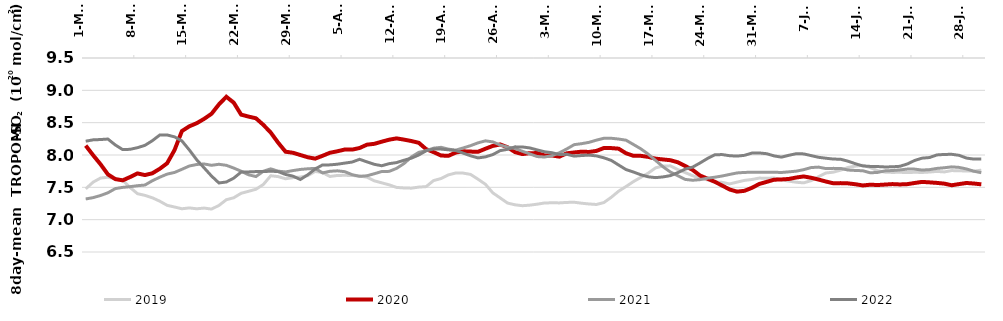
| Category | 2019 | 2020 | 2021 | 2022 |
|---|---|---|---|---|
| 2000-03-01 | 7.476 | 8.146 | 7.32 | 8.213 |
| 2000-03-02 | 7.58 | 7.997 | 7.341 | 8.234 |
| 2000-03-03 | 7.643 | 7.857 | 7.373 | 8.239 |
| 2000-03-04 | 7.656 | 7.7 | 7.416 | 8.247 |
| 2000-03-05 | 7.631 | 7.628 | 7.48 | 8.155 |
| 2000-03-06 | 7.607 | 7.608 | 7.499 | 8.083 |
| 2000-03-07 | 7.497 | 7.659 | 7.51 | 8.088 |
| 2000-03-08 | 7.402 | 7.715 | 7.525 | 8.113 |
| 2000-03-09 | 7.376 | 7.69 | 7.535 | 8.149 |
| 2000-03-10 | 7.339 | 7.717 | 7.602 | 8.221 |
| 2000-03-11 | 7.286 | 7.786 | 7.656 | 8.309 |
| 2000-03-12 | 7.222 | 7.872 | 7.704 | 8.31 |
| 2000-03-13 | 7.196 | 8.076 | 7.73 | 8.281 |
| 2000-03-14 | 7.168 | 8.37 | 7.779 | 8.218 |
| 2000-03-15 | 7.182 | 8.444 | 7.83 | 8.078 |
| 2000-03-16 | 7.168 | 8.492 | 7.853 | 7.926 |
| 2000-03-17 | 7.179 | 8.559 | 7.861 | 7.801 |
| 2000-03-18 | 7.164 | 8.637 | 7.841 | 7.675 |
| 2000-03-19 | 7.22 | 8.782 | 7.857 | 7.568 |
| 2000-03-20 | 7.308 | 8.9 | 7.84 | 7.583 |
| 2000-03-21 | 7.339 | 8.81 | 7.798 | 7.642 |
| 2000-03-22 | 7.408 | 8.624 | 7.749 | 7.736 |
| 2000-03-23 | 7.439 | 8.594 | 7.694 | 7.738 |
| 2000-03-24 | 7.47 | 8.568 | 7.667 | 7.744 |
| 2000-03-25 | 7.544 | 8.466 | 7.749 | 7.743 |
| 2000-03-26 | 7.679 | 8.347 | 7.786 | 7.75 |
| 2000-03-27 | 7.666 | 8.19 | 7.75 | 7.744 |
| 2000-03-28 | 7.632 | 8.051 | 7.738 | 7.699 |
| 2000-03-29 | 7.65 | 8.034 | 7.759 | 7.673 |
| 2000-03-30 | 7.659 | 8 | 7.777 | 7.621 |
| 2000-03-31 | 7.68 | 7.965 | 7.787 | 7.694 |
| 2000-04-01 | 7.746 | 7.944 | 7.793 | 7.784 |
| 2000-04-02 | 7.728 | 7.988 | 7.723 | 7.846 |
| 2000-04-03 | 7.668 | 8.035 | 7.748 | 7.847 |
| 2000-04-04 | 7.684 | 8.057 | 7.755 | 7.857 |
| 2000-04-05 | 7.686 | 8.085 | 7.742 | 7.875 |
| 2000-04-06 | 7.683 | 8.083 | 7.696 | 7.891 |
| 2000-04-07 | 7.676 | 8.108 | 7.67 | 7.933 |
| 2000-04-08 | 7.656 | 8.16 | 7.679 | 7.894 |
| 2000-04-09 | 7.6 | 8.173 | 7.71 | 7.856 |
| 2000-04-10 | 7.57 | 8.206 | 7.745 | 7.834 |
| 2000-04-11 | 7.538 | 8.237 | 7.747 | 7.866 |
| 2000-04-12 | 7.499 | 8.257 | 7.793 | 7.883 |
| 2000-04-13 | 7.49 | 8.238 | 7.867 | 7.919 |
| 2000-04-14 | 7.487 | 8.216 | 7.97 | 7.951 |
| 2000-04-15 | 7.503 | 8.189 | 8.041 | 8 |
| 2000-04-16 | 7.511 | 8.09 | 8.067 | 8.066 |
| 2000-04-17 | 7.605 | 8.045 | 8.106 | 8.092 |
| 2000-04-18 | 7.636 | 7.992 | 8.119 | 8.091 |
| 2000-04-19 | 7.693 | 7.987 | 8.091 | 8.08 |
| 2000-04-20 | 7.722 | 8.038 | 8.075 | 8.069 |
| 2000-04-21 | 7.72 | 8.057 | 8.109 | 8.029 |
| 2000-04-22 | 7.7 | 8.053 | 8.145 | 7.988 |
| 2000-04-23 | 7.626 | 8.049 | 8.188 | 7.955 |
| 2000-04-24 | 7.548 | 8.096 | 8.219 | 7.971 |
| 2000-04-25 | 7.415 | 8.14 | 8.203 | 8.006 |
| 2000-04-26 | 7.336 | 8.163 | 8.154 | 8.068 |
| 2000-04-27 | 7.257 | 8.119 | 8.122 | 8.087 |
| 2000-04-28 | 7.23 | 8.045 | 8.102 | 8.126 |
| 2000-04-29 | 7.216 | 8.014 | 8.057 | 8.124 |
| 2000-04-30 | 7.225 | 8.028 | 8.017 | 8.109 |
| 2000-05-01 | 7.24 | 8.03 | 7.976 | 8.079 |
| 2000-05-02 | 7.259 | 7.994 | 7.969 | 8.05 |
| 2000-05-03 | 7.261 | 7.992 | 7.99 | 8.035 |
| 2000-05-04 | 7.259 | 7.975 | 8.034 | 8.007 |
| 2000-05-05 | 7.267 | 8.026 | 8.094 | 8.011 |
| 2000-05-06 | 7.27 | 8.039 | 8.16 | 7.983 |
| 2000-05-07 | 7.254 | 8.052 | 8.175 | 7.992 |
| 2000-05-08 | 7.243 | 8.047 | 8.196 | 7.998 |
| 2000-05-09 | 7.235 | 8.063 | 8.23 | 7.986 |
| 2000-05-10 | 7.264 | 8.107 | 8.258 | 7.957 |
| 2000-05-11 | 7.345 | 8.107 | 8.259 | 7.917 |
| 2000-05-12 | 7.44 | 8.098 | 8.247 | 7.845 |
| 2000-05-13 | 7.513 | 8.027 | 8.229 | 7.775 |
| 2000-05-14 | 7.589 | 7.988 | 8.163 | 7.737 |
| 2000-05-15 | 7.654 | 7.987 | 8.096 | 7.694 |
| 2000-05-16 | 7.719 | 7.971 | 8.013 | 7.663 |
| 2000-05-17 | 7.801 | 7.943 | 7.915 | 7.65 |
| 2000-05-18 | 7.83 | 7.931 | 7.818 | 7.661 |
| 2000-05-19 | 7.832 | 7.919 | 7.736 | 7.681 |
| 2000-05-20 | 7.774 | 7.887 | 7.68 | 7.728 |
| 2000-05-21 | 7.728 | 7.83 | 7.623 | 7.782 |
| 2000-05-22 | 7.68 | 7.77 | 7.61 | 7.813 |
| 2000-05-23 | 7.643 | 7.682 | 7.619 | 7.877 |
| 2000-05-24 | 7.615 | 7.634 | 7.641 | 7.946 |
| 2000-05-25 | 7.583 | 7.585 | 7.657 | 8.004 |
| 2000-05-26 | 7.577 | 7.527 | 7.676 | 8.006 |
| 2000-05-27 | 7.552 | 7.467 | 7.7 | 7.989 |
| 2000-05-28 | 7.581 | 7.433 | 7.723 | 7.983 |
| 2000-05-29 | 7.607 | 7.446 | 7.731 | 7.995 |
| 2000-05-30 | 7.621 | 7.492 | 7.733 | 8.029 |
| 2000-05-31 | 7.643 | 7.552 | 7.732 | 8.032 |
| 2000-06-01 | 7.64 | 7.584 | 7.734 | 8.02 |
| 2000-06-02 | 7.644 | 7.618 | 7.734 | 7.986 |
| 2000-06-03 | 7.616 | 7.622 | 7.73 | 7.967 |
| 2000-06-04 | 7.596 | 7.629 | 7.739 | 7.996 |
| 2000-06-05 | 7.579 | 7.652 | 7.75 | 8.02 |
| 2000-06-06 | 7.569 | 7.668 | 7.773 | 8.017 |
| 2000-06-07 | 7.603 | 7.648 | 7.806 | 7.991 |
| 2000-06-08 | 7.664 | 7.621 | 7.813 | 7.965 |
| 2000-06-09 | 7.722 | 7.59 | 7.79 | 7.95 |
| 2000-06-10 | 7.735 | 7.563 | 7.793 | 7.938 |
| 2000-06-11 | 7.765 | 7.565 | 7.793 | 7.934 |
| 2000-06-12 | 7.808 | 7.561 | 7.767 | 7.904 |
| 2000-06-13 | 7.827 | 7.548 | 7.761 | 7.865 |
| 2000-06-14 | 7.84 | 7.529 | 7.756 | 7.831 |
| 2000-06-15 | 7.805 | 7.541 | 7.724 | 7.823 |
| 2000-06-16 | 7.757 | 7.536 | 7.731 | 7.822 |
| 2000-06-17 | 7.735 | 7.543 | 7.755 | 7.815 |
| 2000-06-18 | 7.73 | 7.55 | 7.76 | 7.817 |
| 2000-06-19 | 7.733 | 7.545 | 7.769 | 7.825 |
| 2000-06-20 | 7.728 | 7.549 | 7.782 | 7.861 |
| 2000-06-21 | 7.733 | 7.567 | 7.782 | 7.916 |
| 2000-06-22 | 7.73 | 7.584 | 7.767 | 7.951 |
| 2000-06-23 | 7.736 | 7.577 | 7.774 | 7.961 |
| 2000-06-24 | 7.747 | 7.569 | 7.793 | 8.001 |
| 2000-06-25 | 7.738 | 7.557 | 7.803 | 8.009 |
| 2000-06-26 | 7.759 | 7.532 | 7.817 | 8.011 |
| 2000-06-27 | 7.756 | 7.55 | 7.808 | 7.995 |
| 2000-06-28 | 7.753 | 7.567 | 7.784 | 7.952 |
| 2000-06-29 | 7.75 | 7.559 | 7.749 | 7.937 |
| 2000-06-30 | 7.766 | 7.547 | 7.726 | 7.938 |